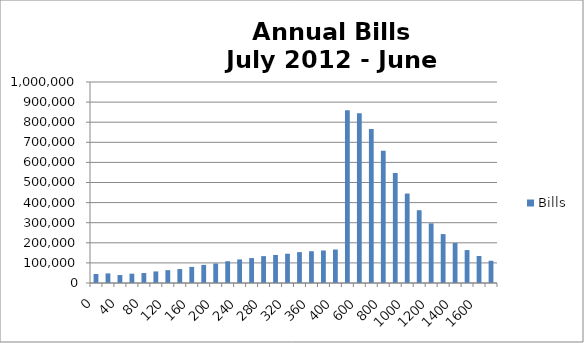
| Category | Bills |
|---|---|
| 0.0 | 44968.478 |
| 20.0 | 47668.77 |
| 40.0 | 39649.939 |
| 60.0 | 46489.332 |
| 80.0 | 49517.582 |
| 100.0 | 57656.993 |
| 120.0 | 63908.607 |
| 140.0 | 69434.001 |
| 160.0 | 80186.75 |
| 180.0 | 90042.073 |
| 200.0 | 96942.154 |
| 220.0 | 108300.711 |
| 240.0 | 117198.922 |
| 260.0 | 123969.433 |
| 280.0 | 133789.821 |
| 300.0 | 139586.082 |
| 320.0 | 145536.764 |
| 340.0 | 153561.513 |
| 360.0 | 158125.946 |
| 380.0 | 161822.398 |
| 400.0 | 166555.811 |
| 500.0 | 859288.666 |
| 600.0 | 844237.774 |
| 700.0 | 765842.191 |
| 800.0 | 657557.351 |
| 900.0 | 547159.621 |
| 1000.0 | 445004.068 |
| 1100.0 | 362165.49 |
| 1200.0 | 296698.198 |
| 1300.0 | 243331.967 |
| 1400.0 | 198823.2 |
| 1500.0 | 163799.02 |
| 1600.0 | 134439.523 |
| 1700.0 | 110561.659 |